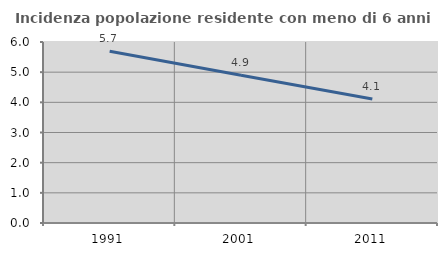
| Category | Incidenza popolazione residente con meno di 6 anni |
|---|---|
| 1991.0 | 5.695 |
| 2001.0 | 4.898 |
| 2011.0 | 4.108 |